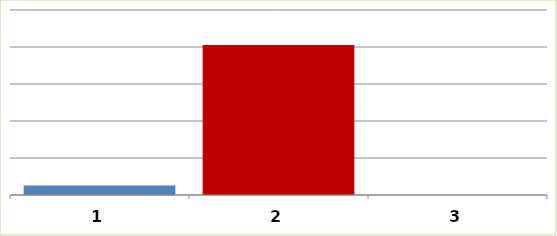
| Category | Series 0 |
|---|---|
| 0 | 127756.65 |
| 1 | 2026158.75 |
| 2 | 0 |